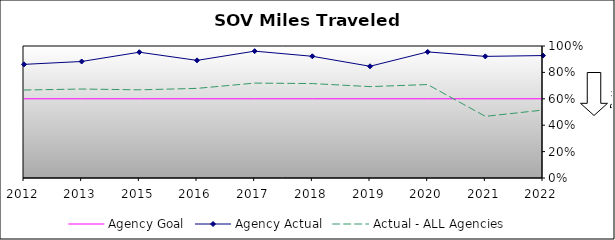
| Category | Agency Goal | Agency Actual | Actual - ALL Agencies |
|---|---|---|---|
| 2012.0 | 0.6 | 0.861 | 0.666 |
| 2013.0 | 0.6 | 0.883 | 0.674 |
| 2015.0 | 0.6 | 0.953 | 0.668 |
| 2016.0 | 0.6 | 0.891 | 0.679 |
| 2017.0 | 0.6 | 0.961 | 0.719 |
| 2018.0 | 0.6 | 0.922 | 0.715 |
| 2019.0 | 0.6 | 0.846 | 0.692 |
| 2020.0 | 0.6 | 0.955 | 0.708 |
| 2021.0 | 0.6 | 0.921 | 0.467 |
| 2022.0 | 0.6 | 0.928 | 0.515 |